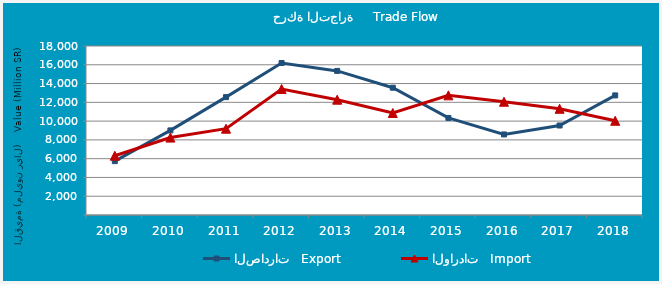
| Category | الصادرات   Export | الواردات   Import |
|---|---|---|
| 2009.0 | 5737118504 | 6313540558 |
| 2010.0 | 9011629823 | 8245949708 |
| 2011.0 | 12555354226 | 9192315544 |
| 2012.0 | 16187192013 | 13422272232 |
| 2013.0 | 15346280897 | 12283000803 |
| 2014.0 | 13557544607 | 10866759327 |
| 2015.0 | 10338461364 | 12744513670 |
| 2016.0 | 8581679738 | 12063866251 |
| 2017.0 | 9532096890 | 11312339451 |
| 2018.0 | 12738548347 | 10036160404 |